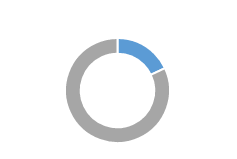
| Category | Series 0 |
|---|---|
| 0 | 0.18 |
| 1 | 0.82 |